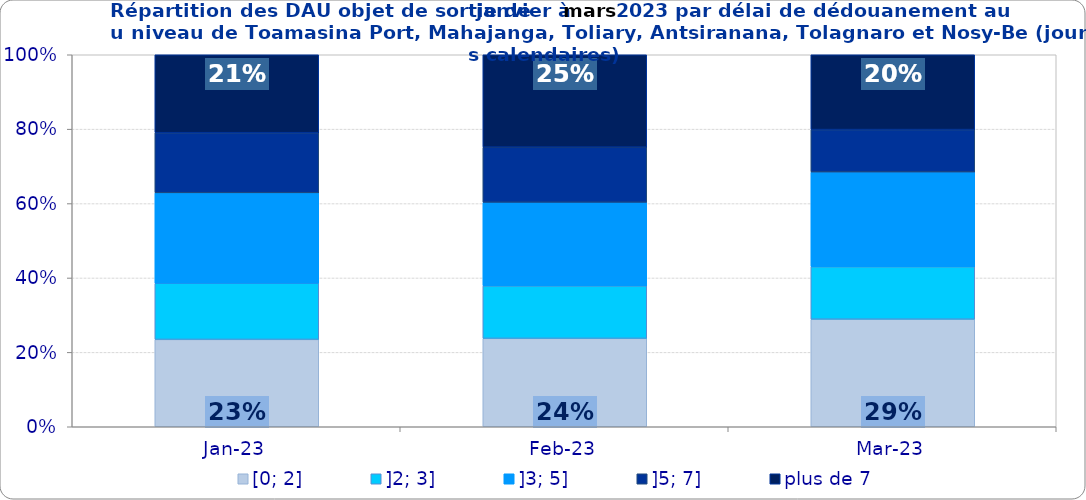
| Category | [0; 2] | ]2; 3] | ]3; 5] | ]5; 7] | plus de 7 |
|---|---|---|---|---|---|
| 2023-01-01 | 0.235 | 0.151 | 0.243 | 0.162 | 0.21 |
| 2023-02-01 | 0.238 | 0.141 | 0.225 | 0.148 | 0.248 |
| 2023-03-01 | 0.289 | 0.141 | 0.255 | 0.114 | 0.201 |